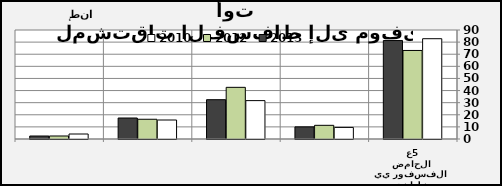
| Category | 2010 | 2012 | 2013 |
|---|---|---|---|
| 0 | 82.808 | 73.106 | 81.28 |
| 1 | 9.572 | 11.289 | 10.019 |
| 2 | 31.697 | 42.652 | 32.455 |
| 3 | 15.685 | 16.302 | 17.334 |
| 4 | 4.123 | 2.481 | 2.47 |